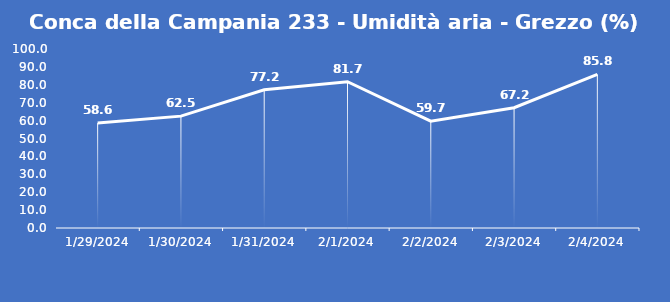
| Category | Conca della Campania 233 - Umidità aria - Grezzo (%) |
|---|---|
| 1/29/24 | 58.6 |
| 1/30/24 | 62.5 |
| 1/31/24 | 77.2 |
| 2/1/24 | 81.7 |
| 2/2/24 | 59.7 |
| 2/3/24 | 67.2 |
| 2/4/24 | 85.8 |